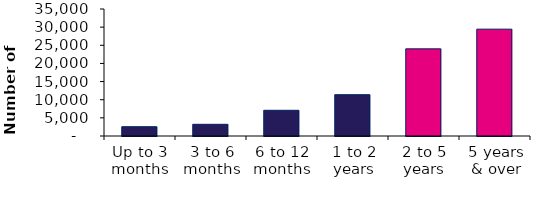
| Category | Series 1 |
|---|---|
| Up to 3 months | 2563 |
| 3 to 6 months | 3223 |
| 6 to 12 months | 7084 |
| 1 to 2 years | 11386 |
| 2 to 5 years | 24022 |
| 5 years & over | 29443 |